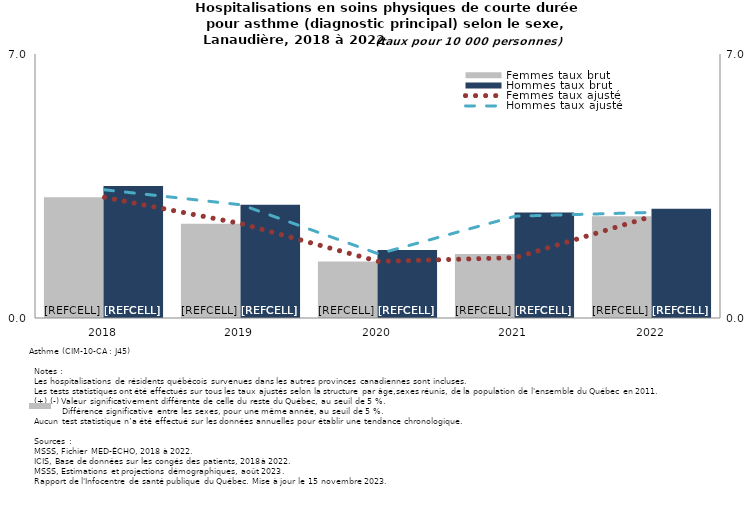
| Category | Femmes taux brut | Hommes taux brut |
|---|---|---|
| 2018.0 | 3.2 | 3.5 |
| 2019.0 | 2.5 | 3 |
| 2020.0 | 1.5 | 1.8 |
| 2021.0 | 1.7 | 2.8 |
| 2022.0 | 2.7 | 2.9 |